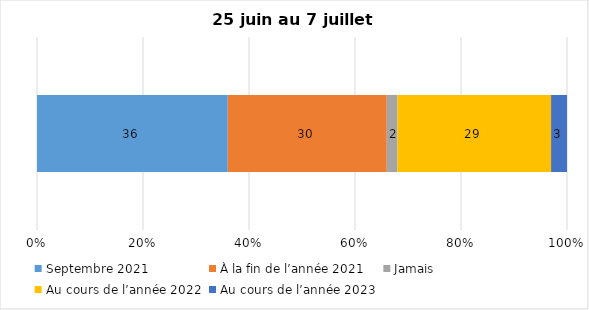
| Category | Septembre 2021 | À la fin de l’année 2021 | Jamais | Au cours de l’année 2022 | Au cours de l’année 2023 |
|---|---|---|---|---|---|
| 0 | 36 | 30 | 2 | 29 | 3 |